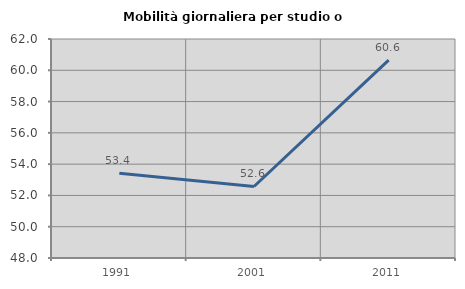
| Category | Mobilità giornaliera per studio o lavoro |
|---|---|
| 1991.0 | 53.42 |
| 2001.0 | 52.572 |
| 2011.0 | 60.649 |